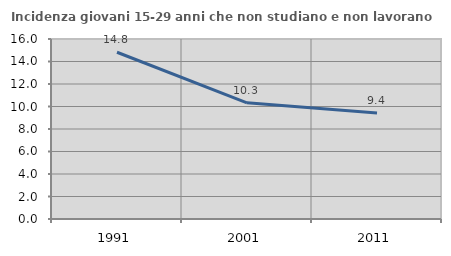
| Category | Incidenza giovani 15-29 anni che non studiano e non lavorano  |
|---|---|
| 1991.0 | 14.823 |
| 2001.0 | 10.324 |
| 2011.0 | 9.429 |